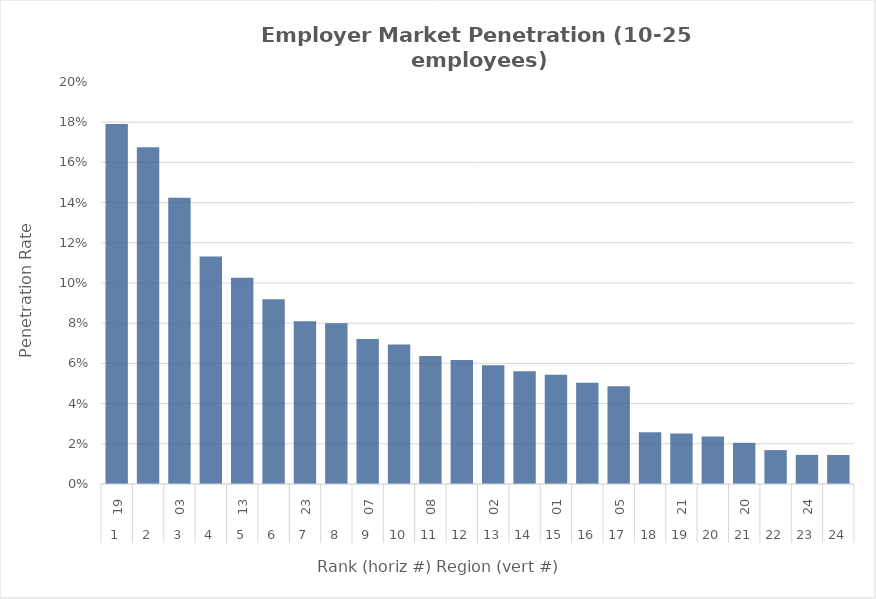
| Category | Rate |
|---|---|
| 0 | 0.179 |
| 1 | 0.168 |
| 2 | 0.142 |
| 3 | 0.113 |
| 4 | 0.103 |
| 5 | 0.092 |
| 6 | 0.081 |
| 7 | 0.08 |
| 8 | 0.072 |
| 9 | 0.069 |
| 10 | 0.064 |
| 11 | 0.062 |
| 12 | 0.059 |
| 13 | 0.056 |
| 14 | 0.054 |
| 15 | 0.05 |
| 16 | 0.049 |
| 17 | 0.026 |
| 18 | 0.025 |
| 19 | 0.024 |
| 20 | 0.02 |
| 21 | 0.017 |
| 22 | 0.015 |
| 23 | 0.014 |